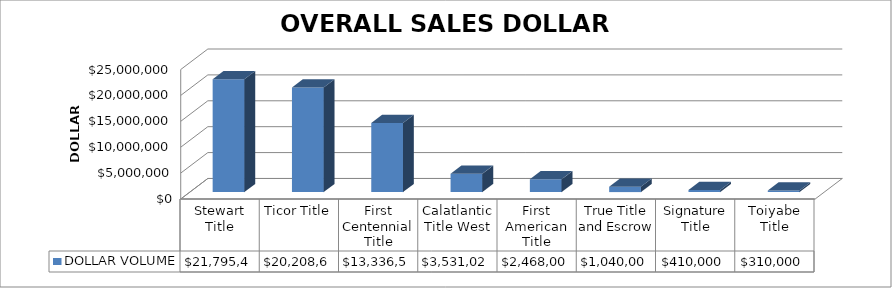
| Category | DOLLAR VOLUME |
|---|---|
| Stewart Title | 21795439 |
| Ticor Title | 20208608 |
| First Centennial Title | 13336500 |
| Calatlantic Title West | 3531028 |
| First American Title | 2468000 |
| True Title and Escrow | 1040000 |
| Signature Title | 410000 |
| Toiyabe Title | 310000 |